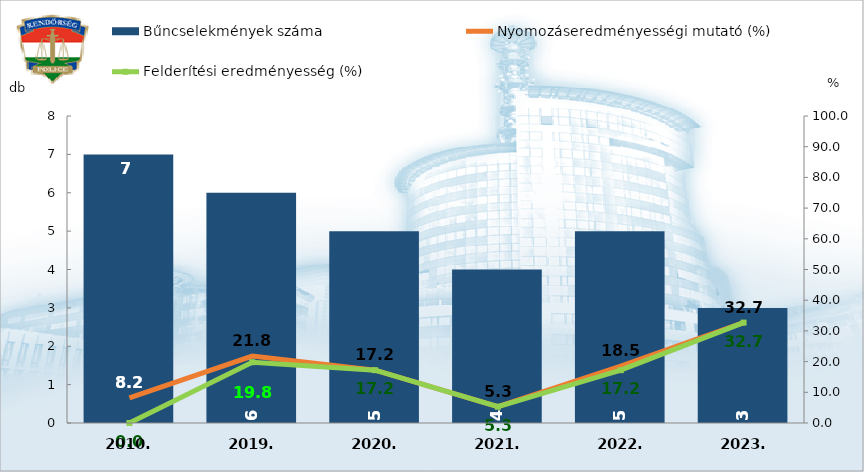
| Category | Bűncselekmények száma |
|---|---|
| 2010. | 7 |
| 2019. | 6 |
| 2020. | 5 |
| 2021. | 4 |
| 2022. | 5 |
| 2023. | 3 |